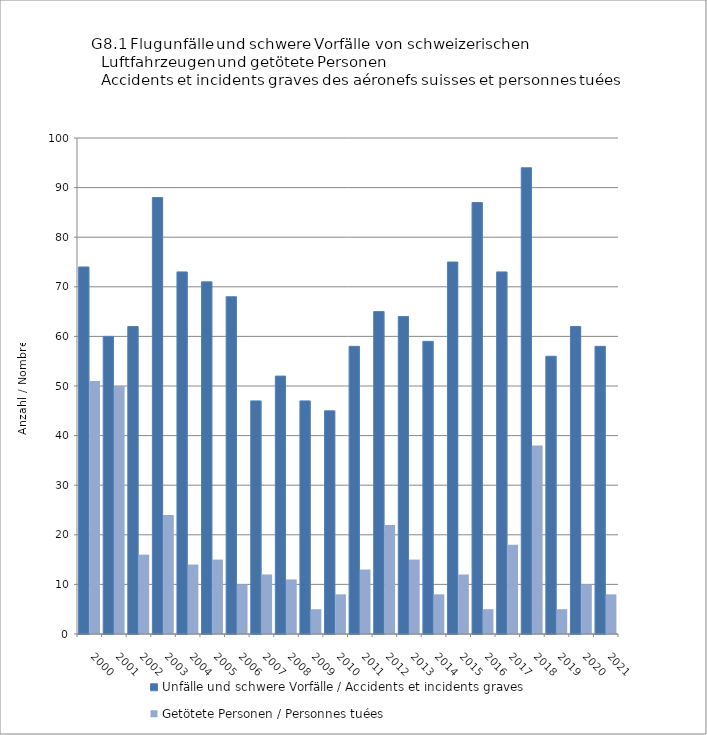
| Category | Unfälle und schwere Vorfälle / Accidents et incidents graves | Getötete Personen / Personnes tuées |
|---|---|---|
| 2000.0 | 74 | 51 |
| 2001.0 | 60 | 50 |
| 2002.0 | 62 | 16 |
| 2003.0 | 88 | 24 |
| 2004.0 | 73 | 14 |
| 2005.0 | 71 | 15 |
| 2006.0 | 68 | 10 |
| 2007.0 | 47 | 12 |
| 2008.0 | 52 | 11 |
| 2009.0 | 47 | 5 |
| 2010.0 | 45 | 8 |
| 2011.0 | 58 | 13 |
| 2012.0 | 65 | 22 |
| 2013.0 | 64 | 15 |
| 2014.0 | 59 | 8 |
| 2015.0 | 75 | 12 |
| 2016.0 | 87 | 5 |
| 2017.0 | 73 | 18 |
| 2018.0 | 94 | 38 |
| 2019.0 | 56 | 5 |
| 2020.0 | 62 | 10 |
| 2021.0 | 58 | 8 |